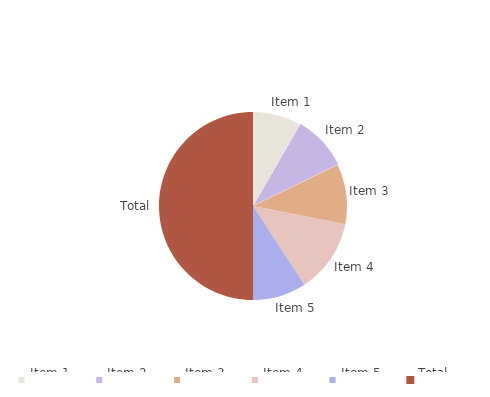
| Category | Total 
income |
|---|---|
| Item 1 | 196.75 |
| Item 2 | 224.625 |
| Item 3 | 244 |
| Item 4 | 300 |
| Item 5 | 218.4 |